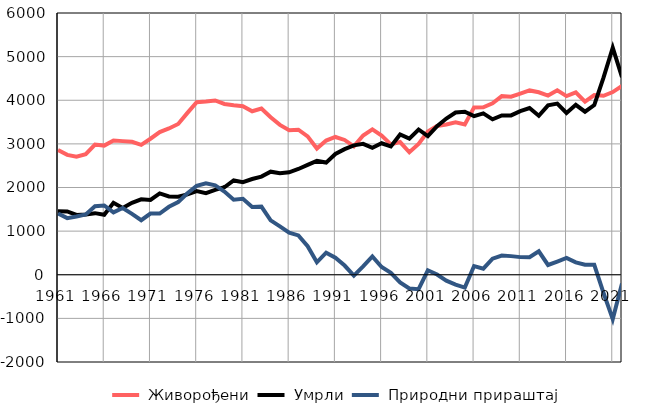
| Category |  Живорођени |  Умрли |  Природни прираштај |
|---|---|---|---|
| 1961.0 | 2860 | 1454 | 1406 |
| 1962.0 | 2748 | 1450 | 1298 |
| 1963.0 | 2704 | 1370 | 1334 |
| 1964.0 | 2762 | 1381 | 1381 |
| 1965.0 | 2983 | 1412 | 1571 |
| 1966.0 | 2961 | 1374 | 1587 |
| 1967.0 | 3079 | 1649 | 1430 |
| 1968.0 | 3063 | 1532 | 1531 |
| 1969.0 | 3047 | 1650 | 1397 |
| 1970.0 | 2978 | 1728 | 1250 |
| 1971.0 | 3118 | 1716 | 1402 |
| 1972.0 | 3269 | 1865 | 1404 |
| 1973.0 | 3353 | 1796 | 1557 |
| 1974.0 | 3456 | 1790 | 1666 |
| 1975.0 | 3710 | 1841 | 1869 |
| 1976.0 | 3953 | 1917 | 2036 |
| 1977.0 | 3969 | 1872 | 2097 |
| 1978.0 | 3996 | 1947 | 2049 |
| 1979.0 | 3915 | 2006 | 1909 |
| 1980.0 | 3884 | 2162 | 1722 |
| 1981.0 | 3865 | 2123 | 1742 |
| 1982.0 | 3748 | 2194 | 1554 |
| 1983.0 | 3811 | 2250 | 1561 |
| 1984.0 | 3609 | 2362 | 1247 |
| 1985.0 | 3436 | 2326 | 1110 |
| 1986.0 | 3311 | 2347 | 964 |
| 1987.0 | 3325 | 2424 | 901 |
| 1988.0 | 3173 | 2519 | 654 |
| 1989.0 | 2894 | 2609 | 285 |
| 1990.0 | 3076 | 2571 | 505 |
| 1991.0 | 3158 | 2769 | 389 |
| 1992.0 | 3090 | 2879 | 211 |
| 1993.0 | 2944 | 2966 | -22 |
| 1994.0 | 3192 | 3000 | 192 |
| 1995.0 | 3331 | 2910 | 421 |
| 1996.0 | 3192 | 3014 | 178 |
| 1997.0 | 2988 | 2943 | 45 |
| 1998.0 | 3041 | 3216 | -175 |
| 1999.0 | 2807 | 3121 | -314 |
| 2000.0 | 3000 | 3330 | -330 |
| 2001.0 | 3282 | 3180 | 102 |
| 2002.0 | 3411 | 3406 | 5 |
| 2003.0 | 3446 | 3581 | -135 |
| 2004.0 | 3493 | 3718 | -225 |
| 2005.0 | 3444 | 3738 | -294 |
| 2006.0 | 3836 | 3637 | 199 |
| 2007.0 | 3837 | 3699 | 138 |
| 2008.0 | 3930 | 3562 | 368 |
| 2009.0 | 4094 | 3653 | 441 |
| 2010.0 | 4080 | 3653 | 427 |
| 2011.0 | 4154 | 3750 | 404 |
| 2012.0 | 4225 | 3822 | 403 |
| 2013.0 | 4183 | 3645 | 538 |
| 2014.0 | 4108 | 3884 | 224 |
| 2015.0 | 4227 | 3924 | 303 |
| 2016.0 | 4095 | 3708 | 387 |
| 2017.0 | 4179 | 3895 | 284 |
| 2018.0 | 3966 | 3737 | 229 |
| 2019.0 | 4118 | 3889 | 229 |
| 2020.0 | 4103 | 4518 | -415 |
| 2021.0 | 4187 | 5203 | -1016 |
| 2022.0 | 4330 | 4531 | -201 |